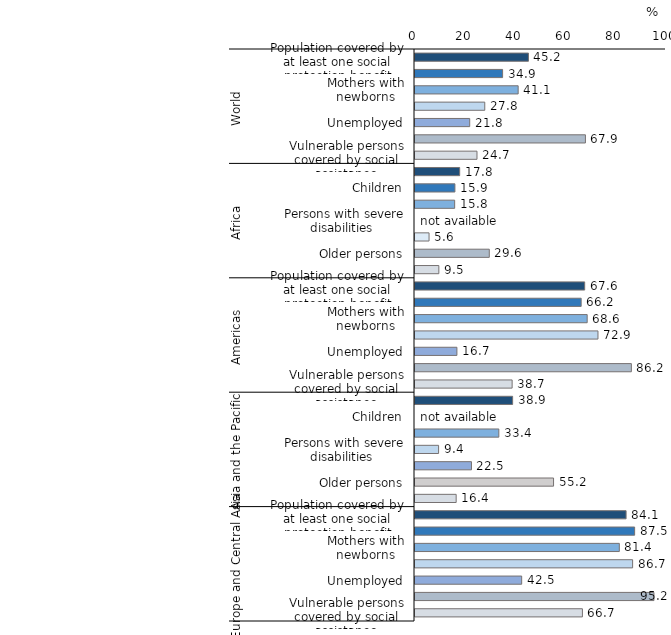
| Category | Series 0 |
|---|---|
| 0 | 45.2 |
| 1 | 34.9 |
| 2 | 41.1 |
| 3 | 27.8 |
| 4 | 21.8 |
| 5 | 67.9 |
| 6 | 24.7 |
| 7 | 17.8 |
| 8 | 15.9 |
| 9 | 15.8 |
| 10 | 0 |
| 11 | 5.6 |
| 12 | 29.6 |
| 13 | 9.5 |
| 14 | 67.6 |
| 15 | 66.2 |
| 16 | 68.6 |
| 17 | 72.9 |
| 18 | 16.7 |
| 19 | 86.2 |
| 20 | 38.7 |
| 21 | 38.9 |
| 22 | 0 |
| 23 | 33.4 |
| 24 | 9.4 |
| 25 | 22.5 |
| 26 | 55.2 |
| 27 | 16.4 |
| 28 | 84.1 |
| 29 | 87.5 |
| 30 | 81.4 |
| 31 | 86.7 |
| 32 | 42.5 |
| 33 | 95.2 |
| 34 | 66.7 |